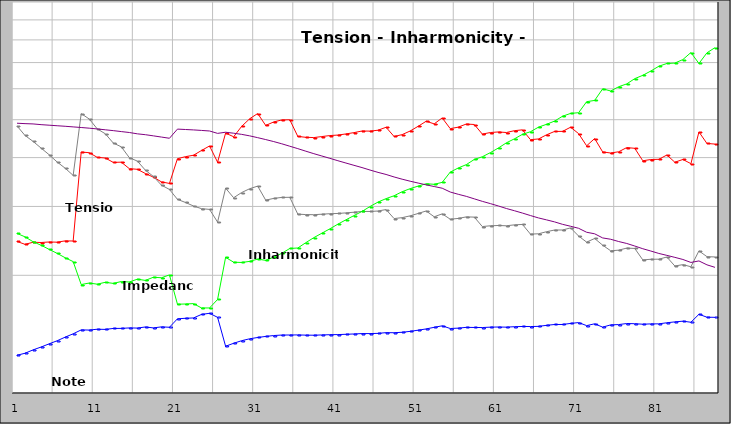
| Category | Series 0 | Series 2 |
|---|---|---|
| 0 | 244.121 | 481.965 |
| 1 | 240.009 | 455.585 |
| 2 | 242.935 | 440.127 |
| 3 | 242.608 | 423.02 |
| 4 | 243.359 | 406.837 |
| 5 | 243.072 | 389.77 |
| 6 | 244.939 | 375.782 |
| 7 | 244.761 | 360.168 |
| 8 | 413.266 | 518.34 |
| 9 | 411.741 | 502.028 |
| 10 | 400.569 | 473.795 |
| 11 | 399.026 | 460.29 |
| 12 | 388.892 | 435.834 |
| 13 | 389.419 | 426.18 |
| 14 | 374.76 | 399.852 |
| 15 | 373.38 | 391.811 |
| 16 | 364.205 | 371.402 |
| 17 | 356.448 | 357.912 |
| 18 | 346.71 | 340.15 |
| 19 | 343.539 | 331.588 |
| 20 | 397.431 | 312.785 |
| 21 | 402.234 | 307.096 |
| 22 | 405.564 | 300.762 |
| 23 | 417.16 | 296.093 |
| 24 | 428.375 | 294.838 |
| 25 | 389.271 | 273.612 |
| 26 | 462.103 | 334.093 |
| 27 | 452.222 | 315.813 |
| 28 | 480.72 | 325.612 |
| 29 | 502.794 | 333.004 |
| 30 | 518.524 | 338.173 |
| 31 | 483.368 | 311.321 |
| 32 | 493.507 | 314.569 |
| 33 | 499.267 | 316.4 |
| 34 | 499.871 | 316.591 |
| 35 | 453.09 | 286.71 |
| 36 | 450.784 | 285.979 |
| 37 | 450.065 | 285.751 |
| 38 | 452.768 | 286.608 |
| 39 | 455.451 | 287.456 |
| 40 | 456.757 | 287.868 |
| 41 | 459.807 | 288.827 |
| 42 | 463.397 | 289.953 |
| 43 | 467.792 | 291.324 |
| 44 | 467.5 | 291.233 |
| 45 | 469.997 | 292.01 |
| 46 | 478.194 | 294.546 |
| 47 | 452.945 | 279.314 |
| 48 | 457.906 | 280.839 |
| 49 | 467.748 | 283.841 |
| 50 | 480.953 | 287.82 |
| 51 | 495.439 | 292.122 |
| 52 | 487.907 | 282.264 |
| 53 | 505.233 | 287.232 |
| 54 | 474.334 | 278.311 |
| 55 | 478.588 | 279.556 |
| 56 | 487.431 | 282.127 |
| 57 | 486.042 | 281.724 |
| 58 | 459.36 | 266.48 |
| 59 | 463.654 | 267.723 |
| 60 | 465.208 | 268.171 |
| 61 | 463.665 | 267.726 |
| 62 | 468.694 | 269.174 |
| 63 | 471.043 | 269.848 |
| 64 | 444.585 | 254.877 |
| 65 | 446.385 | 255.393 |
| 66 | 457.366 | 258.515 |
| 67 | 466.579 | 261.106 |
| 68 | 466.759 | 261.156 |
| 69 | 478.383 | 264.388 |
| 70 | 460.681 | 252.037 |
| 71 | 428.744 | 243.144 |
| 72 | 447.487 | 248.402 |
| 73 | 413.578 | 238.805 |
| 74 | 410.955 | 231.045 |
| 75 | 414.003 | 231.9 |
| 76 | 424.314 | 234.77 |
| 77 | 422.505 | 234.269 |
| 78 | 392.584 | 218.979 |
| 79 | 395.496 | 219.789 |
| 80 | 395.974 | 219.922 |
| 81 | 406.113 | 222.72 |
| 82 | 389.223 | 211.226 |
| 83 | 395.632 | 212.958 |
| 84 | 385.908 | 210.324 |
| 85 | 465.243 | 230.934 |
| 86 | 434.619 | 223.204 |
| 87 | 433.178 | 222.834 |